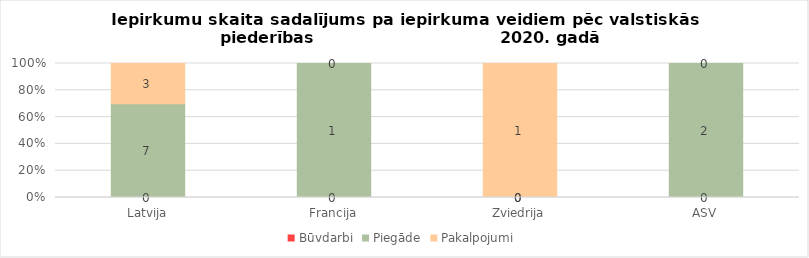
| Category | Būvdarbi | Piegāde | Pakalpojumi |
|---|---|---|---|
| Latvija | 0 | 7 | 3 |
| Francija | 0 | 1 | 0 |
| Zviedrija | 0 | 0 | 1 |
| ASV | 0 | 2 | 0 |